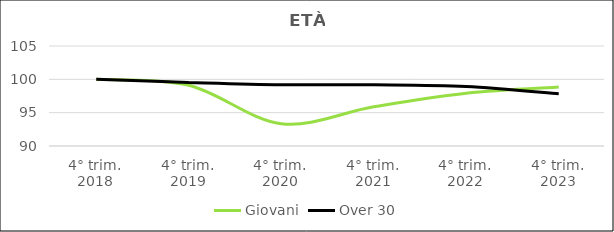
| Category | Giovani | Over 30 |
|---|---|---|
| 4° trim.
2018 | 100 | 100 |
| 4° trim.
2019 | 99.108 | 99.542 |
| 4° trim.
2020 | 93.345 | 99.191 |
| 4° trim.
2021 | 95.883 | 99.185 |
| 4° trim.
2022 | 97.907 | 98.929 |
| 4° trim.
2023 | 98.834 | 97.829 |